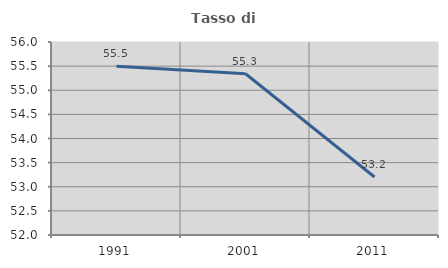
| Category | Tasso di occupazione   |
|---|---|
| 1991.0 | 55.499 |
| 2001.0 | 55.342 |
| 2011.0 | 53.201 |